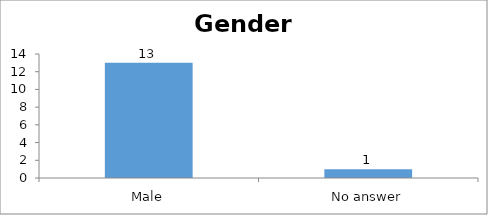
| Category | Gender |
|---|---|
| Male | 13 |
| No answer | 1 |